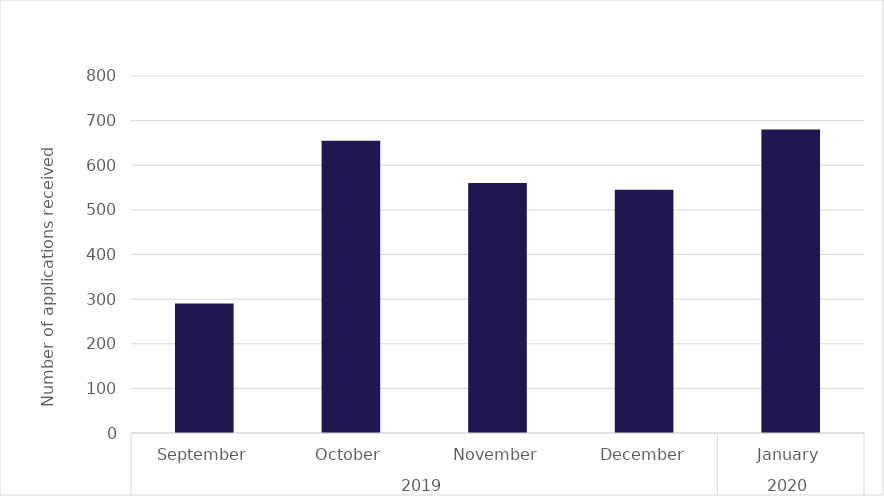
| Category | Series 0 |
|---|---|
| 0 | 290 |
| 1 | 655 |
| 2 | 560 |
| 3 | 545 |
| 4 | 680 |